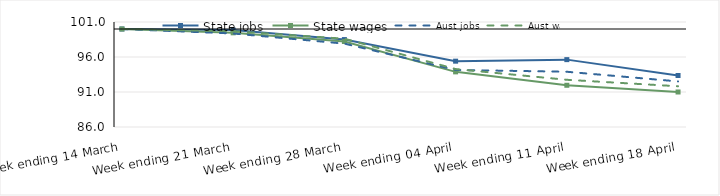
| Category | State jobs | State wages | Aust jobs | Aust wages |
|---|---|---|---|---|
| 2020-03-14 | 100 | 100 | 100 | 100 |
| 2020-03-21 | 99.85 | 99.453 | 99.358 | 99.683 |
| 2020-03-28 | 98.489 | 98.218 | 97.912 | 98.613 |
| 2020-04-04 | 95.404 | 93.876 | 94.152 | 94.278 |
| 2020-04-11 | 95.624 | 91.961 | 93.892 | 92.743 |
| 2020-04-18 | 93.359 | 91.001 | 92.512 | 91.82 |